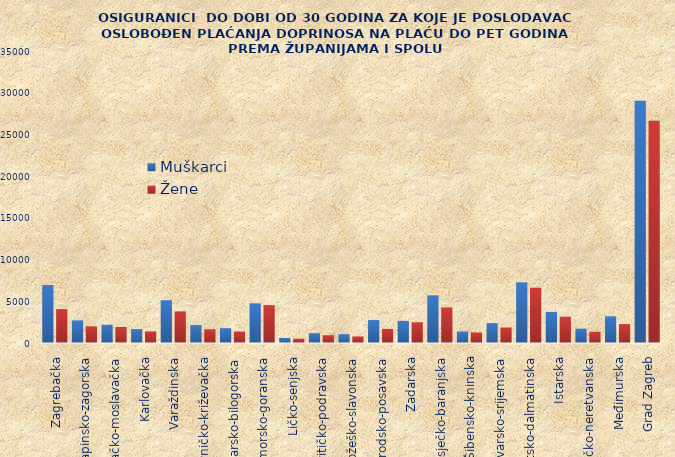
| Category | Muškarci | Žene |
|---|---|---|
| Zagrebačka | 6947 | 4062 |
| Krapinsko-zagorska | 2708 | 2003 |
| Sisačko-moslavačka | 2180 | 1925 |
| Karlovačka | 1662 | 1394 |
| Varaždinska | 5127 | 3794 |
| Koprivničko-križevačka | 2152 | 1645 |
| Bjelovarsko-bilogorska | 1776 | 1368 |
| Primorsko-goranska | 4751 | 4539 |
| Ličko-senjska | 609 | 510 |
| Virovitičko-podravska | 1170 | 932 |
| Požeško-slavonska | 1059 | 788 |
| Brodsko-posavska | 2749 | 1689 |
| Zadarska | 2649 | 2479 |
| Osječko-baranjska | 5712 | 4250 |
| Šibensko-kninska | 1368 | 1269 |
| Vukovarsko-srijemska | 2383 | 1847 |
| Splitsko-dalmatinska | 7269 | 6626 |
| Istarska | 3723 | 3147 |
| Dubrovačko-neretvanska | 1708 | 1340 |
| Međimurska | 3193 | 2268 |
| Grad Zagreb | 29041 | 26648 |